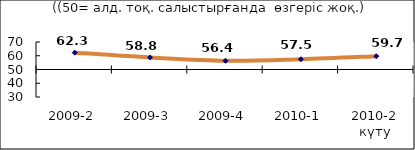
| Category | Диф.индекс ↓ |
|---|---|
| 2009-2 | 62.255 |
| 2009-3 | 58.75 |
| 2009-4 | 56.36 |
| 2010-1 | 57.475 |
| 2010-2 күту | 59.665 |